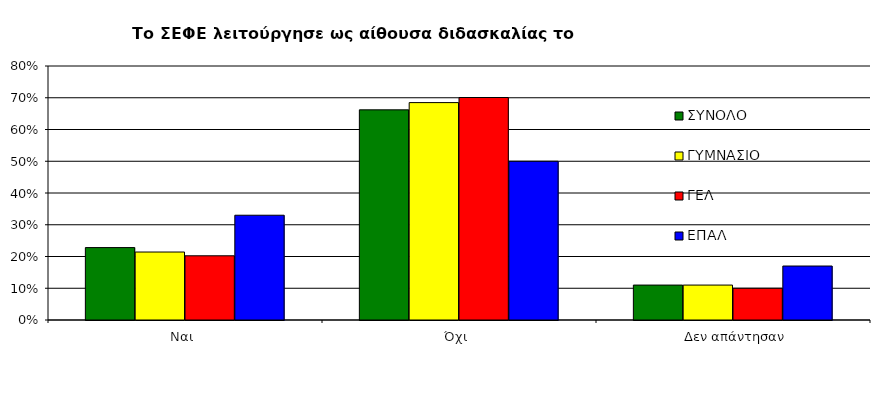
| Category | ΣΥΝΟΛΟ | ΓΥΜΝΑΣΙΟ | ΓΕΛ | ΕΠΑΛ |
|---|---|---|---|---|
| Ναι  | 0.228 | 0.214 | 0.202 | 0.33 |
| Όχι  | 0.662 | 0.685 | 0.701 | 0.5 |
|  Δεν απάντησαν | 0.11 | 0.11 | 0.1 | 0.17 |